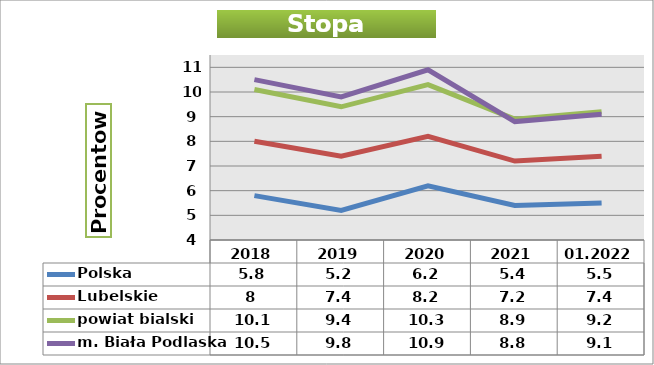
| Category | Polska | Lubelskie | powiat bialski | m. Biała Podlaska |
|---|---|---|---|---|
| 2018 | 5.8 | 8 | 10.1 | 10.5 |
| 2019 | 5.2 | 7.4 | 9.4 | 9.8 |
| 2020 | 6.2 | 8.2 | 10.3 | 10.9 |
| 2021 | 5.4 | 7.2 | 8.9 | 8.8 |
| 01.2022 | 5.5 | 7.4 | 9.2 | 9.1 |